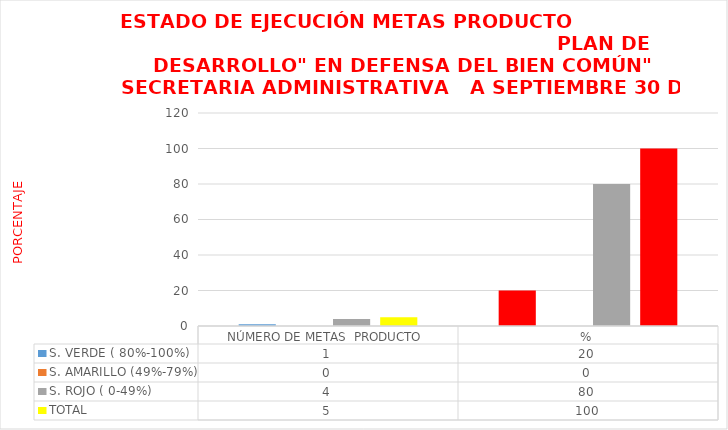
| Category | S. VERDE ( 80%-100%)  | S. AMARILLO (49%-79%) | S. ROJO ( 0-49%) | TOTAL  |
|---|---|---|---|---|
| NÚMERO DE METAS  PRODUCTO  | 1 | 0 | 4 | 5 |
| % | 20 | 0 | 80 | 100 |